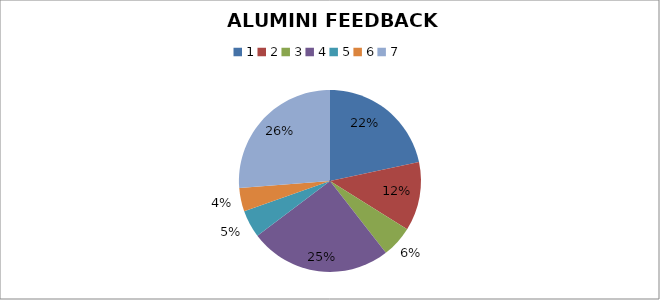
| Category | Series 0 | Series 1 | Series 2 |
|---|---|---|---|
| 0 | 310 | 203 | 9 |
| 1 | 175 | 300 | 0 |
| 2 | 80 | 253 | 33 |
| 3 | 361 | 140 | 8 |
| 4 | 70 | 404 | 20 |
| 5 | 60 | 427 | 35 |
| 6 | 375 | 120 | 1 |